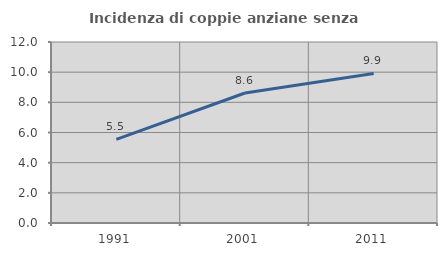
| Category | Incidenza di coppie anziane senza figli  |
|---|---|
| 1991.0 | 5.542 |
| 2001.0 | 8.621 |
| 2011.0 | 9.912 |